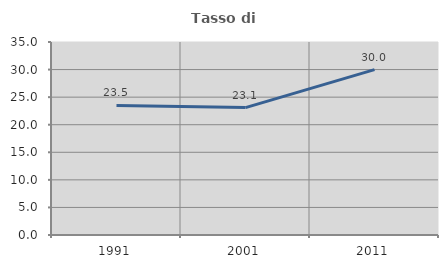
| Category | Tasso di occupazione   |
|---|---|
| 1991.0 | 23.499 |
| 2001.0 | 23.11 |
| 2011.0 | 29.993 |